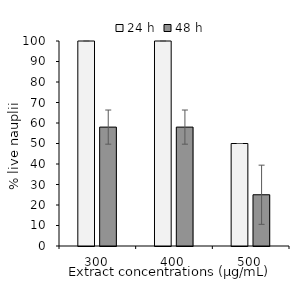
| Category | 24 h | 48 h |
|---|---|---|
| 300.0 | 100 | 58 |
| 400.0 | 100 | 58 |
| 500.0 | 50 | 25 |